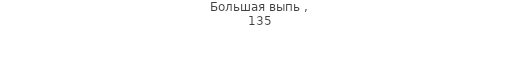
| Category | Большая выпь  |
|---|---|
| 0 | 135 |